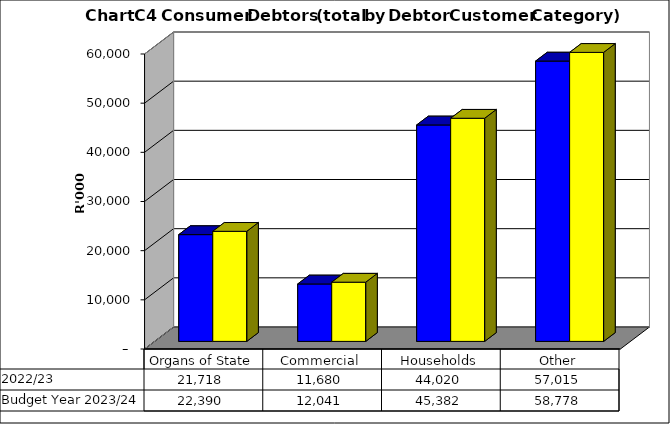
| Category |  2022/23  | Budget Year 2023/24 |
|---|---|---|
| Organs of State | 21717942.07 | 22389631 |
| Commercial | 11679763.21 | 12040993 |
| Households | 44020495.38 | 45381954 |
| Other | 57015088.74 | 58778442 |